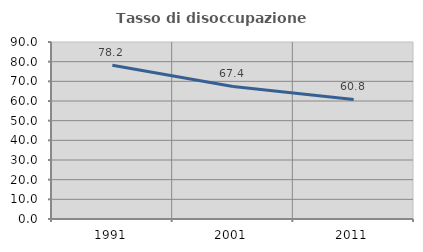
| Category | Tasso di disoccupazione giovanile  |
|---|---|
| 1991.0 | 78.152 |
| 2001.0 | 67.406 |
| 2011.0 | 60.822 |